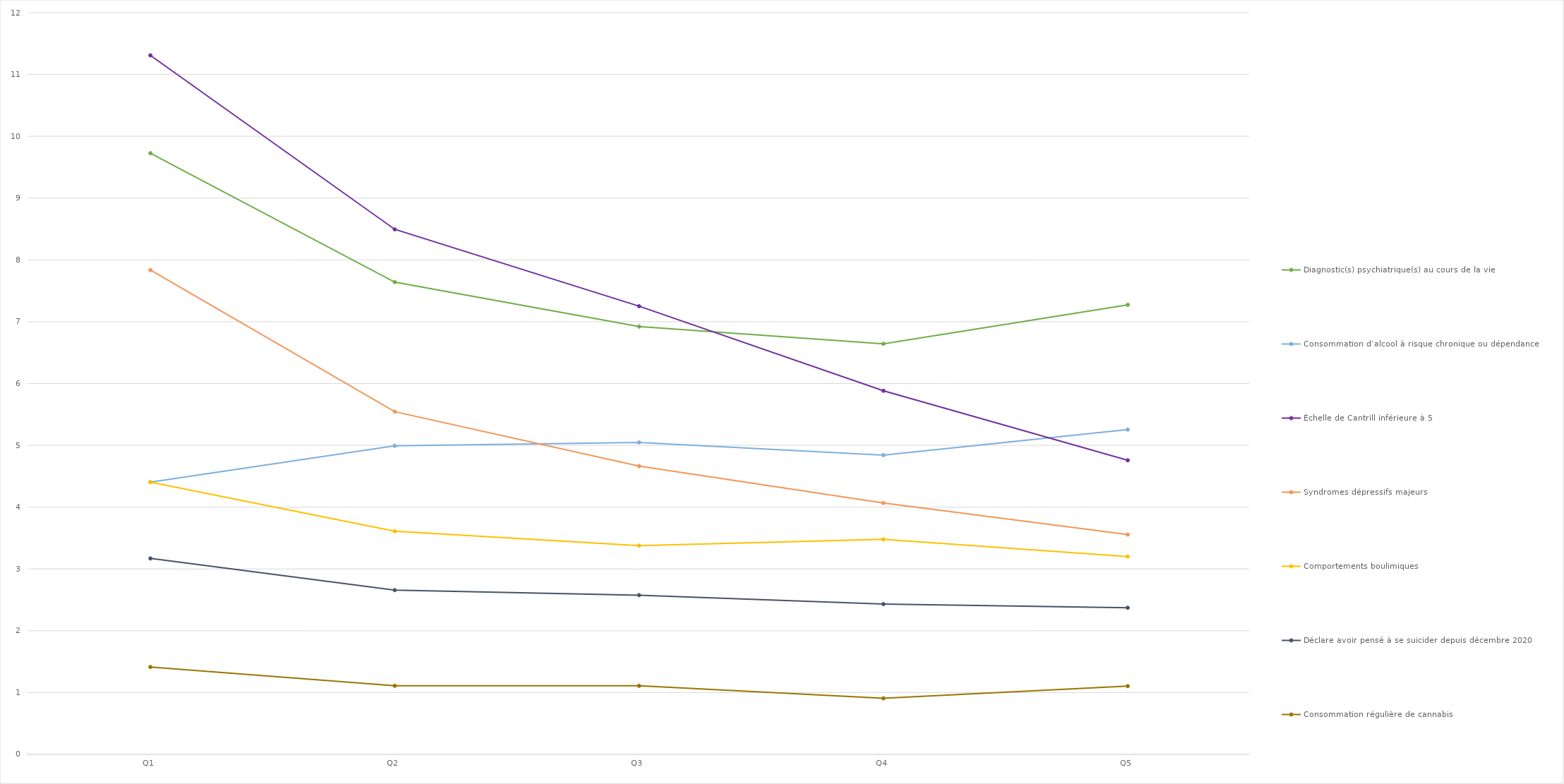
| Category | Diagnostic(s) psychiatrique(s) au cours de la vie | Consommation d’alcool à risque chronique ou dépendance | Échelle de Cantrill inférieure à 5 | Syndromes dépressifs majeurs | Comportements boulimiques | Déclare avoir pensé à se suicider depuis décembre 2020 | Consommation régulière de cannabis |
|---|---|---|---|---|---|---|---|
| Q1 | 9.727 | 4.405 | 11.31 | 7.836 | 4.405 | 3.17 | 1.414 |
| Q2 | 7.641 | 4.993 | 8.495 | 5.545 | 3.611 | 2.657 | 1.109 |
| Q3 | 6.922 | 5.048 | 7.251 | 4.665 | 3.378 | 2.576 | 1.109 |
| Q4 | 6.643 | 4.842 | 5.883 | 4.067 | 3.479 | 2.431 | 0.907 |
| Q5 | 7.273 | 5.255 | 4.758 | 3.557 | 3.201 | 2.372 | 1.104 |